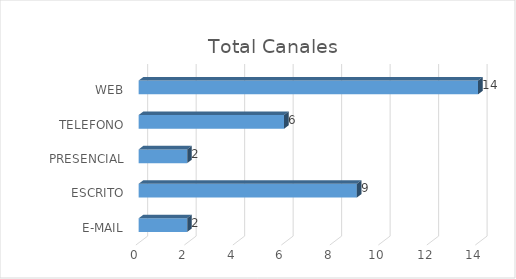
| Category | Total |
|---|---|
| E-MAIL | 2 |
| ESCRITO | 9 |
| PRESENCIAL | 2 |
| TELEFONO | 6 |
| WEB | 14 |